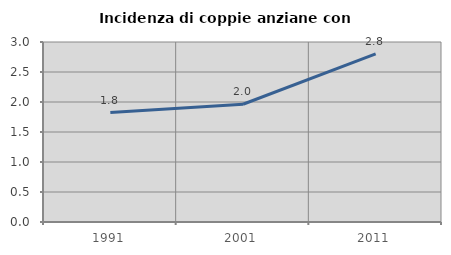
| Category | Incidenza di coppie anziane con figli |
|---|---|
| 1991.0 | 1.824 |
| 2001.0 | 1.963 |
| 2011.0 | 2.801 |